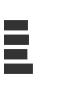
| Category | Series 0 |
|---|---|
| 0 | 0.319 |
| 1 | 0.333 |
| 2 | 0.311 |
| 3 | 0.388 |